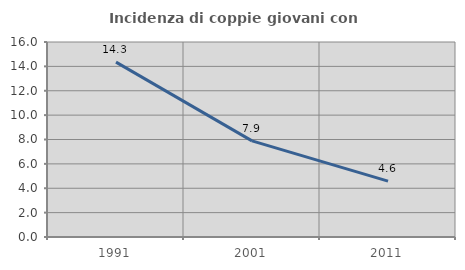
| Category | Incidenza di coppie giovani con figli |
|---|---|
| 1991.0 | 14.345 |
| 2001.0 | 7.889 |
| 2011.0 | 4.583 |